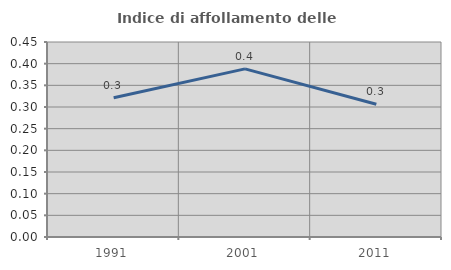
| Category | Indice di affollamento delle abitazioni  |
|---|---|
| 1991.0 | 0.321 |
| 2001.0 | 0.388 |
| 2011.0 | 0.307 |